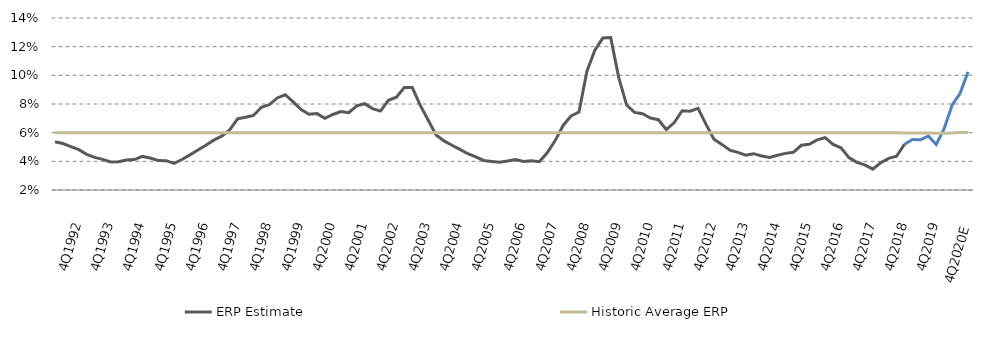
| Category | ERP Estimate | Historic Average ERP |
|---|---|---|
| 4Q2020E | 0.102 | 0.06 |
| 3Q2020 | 0.087 | 0.06 |
| 2Q2020 | 0.079 | 0.06 |
| 1Q2020 | 0.063 | 0.06 |
| 4Q2019 | 0.052 | 0.06 |
| 3Q2019 | 0.058 | 0.06 |
| 2Q2019 | 0.055 | 0.06 |
| 1Q2019 | 0.055 | 0.06 |
| 4Q2018 | 0.052 | 0.06 |
| 3Q2018 | 0.044 | 0.06 |
| 2Q2018 | 0.042 | 0.06 |
| 1Q2018 | 0.039 | 0.06 |
| 4Q2017 | 0.035 | 0.06 |
| 3Q2017 | 0.038 | 0.06 |
| 2Q2017 | 0.039 | 0.06 |
| 1Q2017 | 0.043 | 0.06 |
| 4Q2016 | 0.049 | 0.06 |
| 3Q2016 | 0.052 | 0.06 |
| 2Q2016 | 0.057 | 0.06 |
| 1Q2016 | 0.055 | 0.06 |
| 4Q2015 | 0.052 | 0.06 |
| 3Q2015  | 0.051 | 0.06 |
| 2Q2015 | 0.046 | 0.06 |
| 1Q2015 | 0.046 | 0.06 |
| 4Q2014 | 0.044 | 0.06 |
| 3Q2014 | 0.043 | 0.06 |
| 2Q2014 | 0.044 | 0.06 |
| 1Q2014 | 0.045 | 0.06 |
| 4Q2013 | 0.044 | 0.06 |
| 3Q2013 | 0.046 | 0.06 |
| 2Q2013 | 0.048 | 0.06 |
| 1Q2013 | 0.052 | 0.06 |
| 4Q2012 | 0.055 | 0.06 |
| 3Q2012 | 0.066 | 0.06 |
| 2Q2012 | 0.077 | 0.06 |
| 1Q2012 | 0.075 | 0.06 |
| 4Q2011 | 0.075 | 0.06 |
| 3Q2011 | 0.067 | 0.06 |
| 2Q2011 | 0.062 | 0.06 |
| 1Q2011 | 0.069 | 0.06 |
| 4Q2010 | 0.07 | 0.06 |
| 3Q2010 | 0.073 | 0.06 |
| 2Q2010 | 0.074 | 0.06 |
| 1Q2010 | 0.079 | 0.06 |
| 4Q2009 | 0.099 | 0.06 |
| 3Q2009 | 0.126 | 0.06 |
| 2Q2009 | 0.126 | 0.06 |
| 1Q2009 | 0.118 | 0.06 |
| 4Q2008 | 0.103 | 0.06 |
| 3Q2008 | 0.074 | 0.06 |
| 2Q2008 | 0.072 | 0.06 |
| 1Q2008 | 0.065 | 0.06 |
| 4Q2007 | 0.054 | 0.06 |
| 3Q2007 | 0.046 | 0.06 |
| 2Q2007 | 0.04 | 0.06 |
| 1Q2007 | 0.04 | 0.06 |
| 4Q2006 | 0.04 | 0.06 |
| 3Q2006 | 0.041 | 0.06 |
| 2Q2006 | 0.04 | 0.06 |
| 1Q2006 | 0.039 | 0.06 |
| 4Q2005 | 0.04 | 0.06 |
| 3Q2005 | 0.041 | 0.06 |
| 2Q2005 | 0.043 | 0.06 |
| 1Q2005 | 0.045 | 0.06 |
| 4Q2004 | 0.048 | 0.06 |
| 3Q2004 | 0.051 | 0.06 |
| 2Q2004 | 0.054 | 0.06 |
| 1Q2004 | 0.058 | 0.06 |
| 4Q2003 | 0.069 | 0.06 |
| 3Q2003 | 0.079 | 0.06 |
| 2Q2003 | 0.091 | 0.06 |
| 1Q2003 | 0.092 | 0.06 |
| 4Q2002 | 0.085 | 0.06 |
| 3Q2002 | 0.083 | 0.06 |
| 2Q2002 | 0.075 | 0.06 |
| 1Q2002 | 0.077 | 0.06 |
| 4Q2001 | 0.08 | 0.06 |
| 3Q2001 | 0.079 | 0.06 |
| 2Q2001 | 0.074 | 0.06 |
| 1Q2001 | 0.075 | 0.06 |
| 4Q2000 | 0.073 | 0.06 |
| 3Q2000 | 0.07 | 0.06 |
| 2Q2000 | 0.073 | 0.06 |
| 1Q2000 | 0.073 | 0.06 |
| 4Q1999 | 0.076 | 0.06 |
| 3Q1999 | 0.081 | 0.06 |
| 2Q1999 | 0.086 | 0.06 |
| 1Q1999 | 0.084 | 0.06 |
| 4Q1998 | 0.08 | 0.06 |
| 3Q1998 | 0.078 | 0.06 |
| 2Q1998 | 0.072 | 0.06 |
| 1Q1998 | 0.071 | 0.06 |
| 4Q1997 | 0.07 | 0.06 |
| 3Q1997 | 0.062 | 0.06 |
| 2Q1997 | 0.058 | 0.06 |
| 1Q1997 | 0.055 | 0.06 |
| 4Q1996 | 0.051 | 0.06 |
| 3Q1996 | 0.048 | 0.06 |
| 2Q1996 | 0.045 | 0.06 |
| 1Q1996 | 0.041 | 0.06 |
| 4Q1995 | 0.039 | 0.06 |
| 3Q1995 | 0.04 | 0.06 |
| 2Q1995 | 0.04 | 0.06 |
| 1Q1995 | 0.042 | 0.06 |
| 4Q1994 | 0.043 | 0.06 |
| 3Q1994 | 0.041 | 0.06 |
| 2Q1994 | 0.041 | 0.06 |
| 1Q1994 | 0.04 | 0.06 |
| 4Q1993 | 0.04 | 0.06 |
| 3Q1993 | 0.041 | 0.06 |
| 2Q1993 | 0.043 | 0.06 |
| 1Q1993 | 0.045 | 0.06 |
| 4Q1992 | 0.048 | 0.06 |
| 3Q1992 | 0.05 | 0.06 |
| 2Q1992 | 0.052 | 0.06 |
| 1Q1992 | 0.054 | 0.06 |